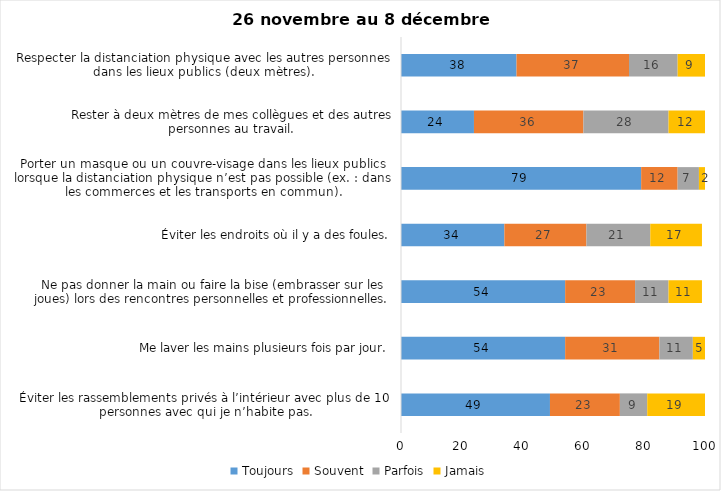
| Category | Toujours | Souvent | Parfois | Jamais |
|---|---|---|---|---|
| Éviter les rassemblements privés à l’intérieur avec plus de 10 personnes avec qui je n’habite pas. | 49 | 23 | 9 | 19 |
| Me laver les mains plusieurs fois par jour. | 54 | 31 | 11 | 5 |
| Ne pas donner la main ou faire la bise (embrasser sur les joues) lors des rencontres personnelles et professionnelles. | 54 | 23 | 11 | 11 |
| Éviter les endroits où il y a des foules. | 34 | 27 | 21 | 17 |
| Porter un masque ou un couvre-visage dans les lieux publics lorsque la distanciation physique n’est pas possible (ex. : dans les commerces et les transports en commun). | 79 | 12 | 7 | 2 |
| Rester à deux mètres de mes collègues et des autres personnes au travail. | 24 | 36 | 28 | 12 |
| Respecter la distanciation physique avec les autres personnes dans les lieux publics (deux mètres). | 38 | 37 | 16 | 9 |